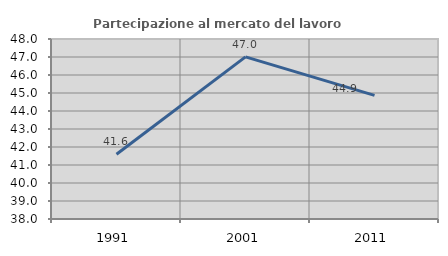
| Category | Partecipazione al mercato del lavoro  femminile |
|---|---|
| 1991.0 | 41.599 |
| 2001.0 | 47.005 |
| 2011.0 | 44.869 |